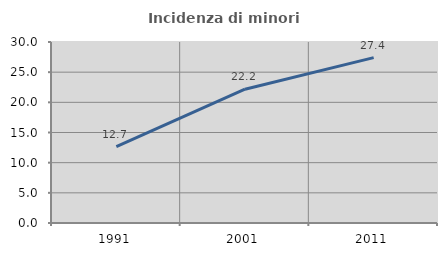
| Category | Incidenza di minori stranieri |
|---|---|
| 1991.0 | 12.676 |
| 2001.0 | 22.177 |
| 2011.0 | 27.415 |